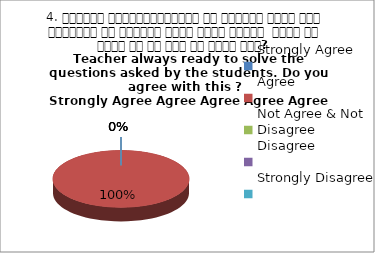
| Category | 4. शिक्षक विद्यार्थियों के द्वारा पूछे गये प्रश्नो का समाधान करने हेतु तत्पर  रहते है क्या आप इस बात से सहमत हैं? 
 Teacher always ready to solve the questions asked by the students. Do you agree with this ? 
 Strongly Agree Agree Agree Agree Agree |
|---|---|
| Strongly Agree | 0 |
| Agree | 4 |
| Not Agree & Not Disagree | 0 |
| Disagree | 0 |
| Strongly Disagree | 0 |